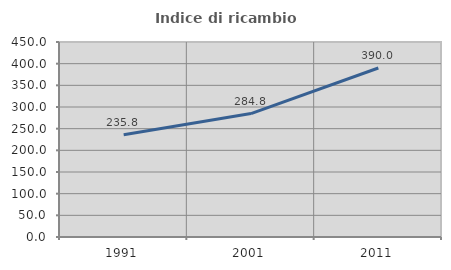
| Category | Indice di ricambio occupazionale  |
|---|---|
| 1991.0 | 235.789 |
| 2001.0 | 284.81 |
| 2011.0 | 390 |